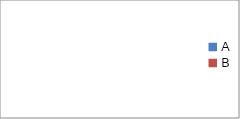
| Category | Series 1 | Series 0 |
|---|---|---|
| A | 0 | 0 |
| B | 0 | 0 |